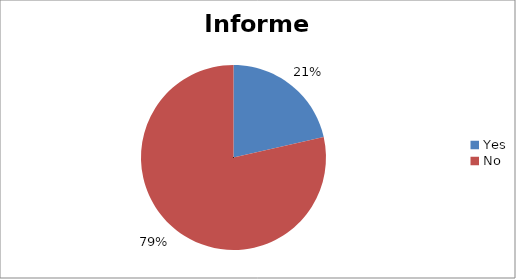
| Category | Informed |
|---|---|
| Yes | 3 |
| No | 11 |